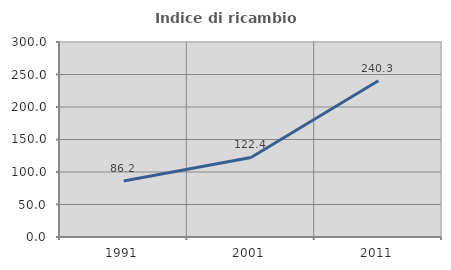
| Category | Indice di ricambio occupazionale  |
|---|---|
| 1991.0 | 86.224 |
| 2001.0 | 122.444 |
| 2011.0 | 240.295 |